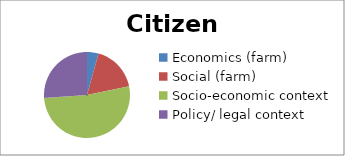
| Category | Citizens | Total |
|---|---|---|
| Economics (farm) | 12 | 23 |
| Social (farm) | 19 | 40 |
| Socio-economic context | 17 | 31 |
| Policy/ legal context | 42 | 52 |